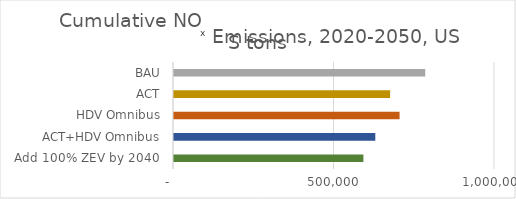
| Category | Cumulative NOx Emissions, 2020-2050, US tons |
|---|---|
|  Add 100% ZEV by 2040  | 589981.535 |
| ACT+HDV Omnibus | 627110 |
| HDV Omnibus | 702750 |
| ACT | 673240 |
| BAU | 782610 |